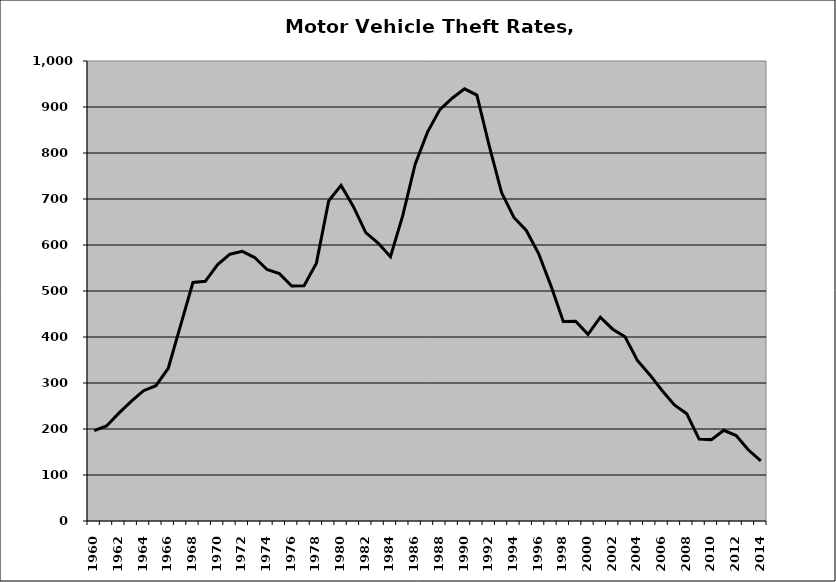
| Category | Motor Vehicle |
|---|---|
| 1960.0 | 196.282 |
| 1961.0 | 206.614 |
| 1962.0 | 234.444 |
| 1963.0 | 260.062 |
| 1964.0 | 283.194 |
| 1965.0 | 294.125 |
| 1966.0 | 332.038 |
| 1967.0 | 425.289 |
| 1968.0 | 518.508 |
| 1969.0 | 521.013 |
| 1970.0 | 557.423 |
| 1971.0 | 580.082 |
| 1972.0 | 586.168 |
| 1973.0 | 572.735 |
| 1974.0 | 546.698 |
| 1975.0 | 537.685 |
| 1976.0 | 510.66 |
| 1977.0 | 511.516 |
| 1978.0 | 560.598 |
| 1979.0 | 696.195 |
| 1980.0 | 729.526 |
| 1981.0 | 683.327 |
| 1982.0 | 626.781 |
| 1983.0 | 604.272 |
| 1984.0 | 574.571 |
| 1985.0 | 664.335 |
| 1986.0 | 775.538 |
| 1987.0 | 845.373 |
| 1988.0 | 894.378 |
| 1989.0 | 919.157 |
| 1990.0 | 939.537 |
| 1991.0 | 925.863 |
| 1992.0 | 815.56 |
| 1993.0 | 713.961 |
| 1994.0 | 659.97 |
| 1995.0 | 631.643 |
| 1996.0 | 581.335 |
| 1997.0 | 511.176 |
| 1998.0 | 433.58 |
| 1999.0 | 434.179 |
| 2000.0 | 405.866 |
| 2001.0 | 443.044 |
| 2002.0 | 416.956 |
| 2003.0 | 400.421 |
| 2004.0 | 348.94 |
| 2005.0 | 318.08 |
| 2006.0 | 283.602 |
| 2007.0 | 252.408 |
| 2008.0 | 232.934 |
| 2009.0 | 178.049 |
| 2010.0 | 176.936 |
| 2011.0 | 197.119 |
| 2012.0 | 185.853 |
| 2013.0 | 154.25 |
| 2014.0 | 130.955 |